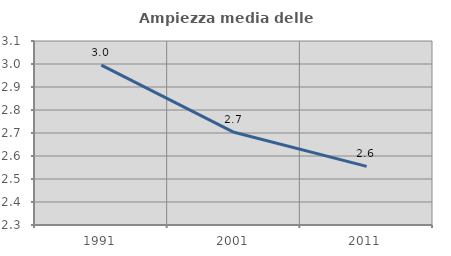
| Category | Ampiezza media delle famiglie |
|---|---|
| 1991.0 | 2.995 |
| 2001.0 | 2.703 |
| 2011.0 | 2.555 |